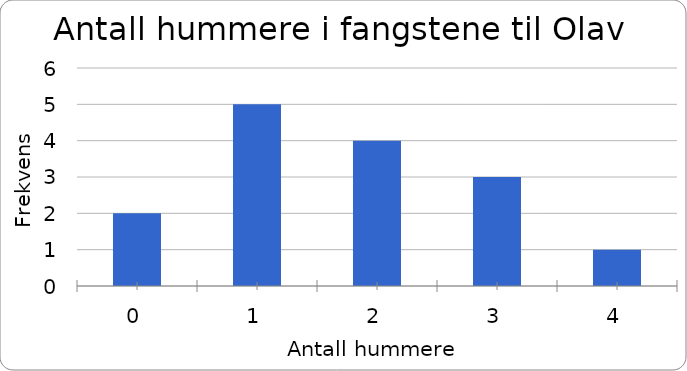
| Category | Frekvens |
|---|---|
| 0.0 | 2 |
| 1.0 | 5 |
| 2.0 | 4 |
| 3.0 | 3 |
| 4.0 | 1 |